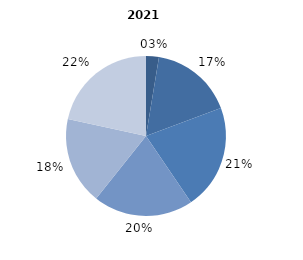
| Category | 2021 |
|---|---|
| până la 25 ani | 2.6 |
| 25-34 ani | 16.7 |
| 35-44 ani | 21.2 |
| 45-54 ani | 20.2 |
| 55-64 ani | 17.7 |
| 65 ani şi peste | 21.6 |